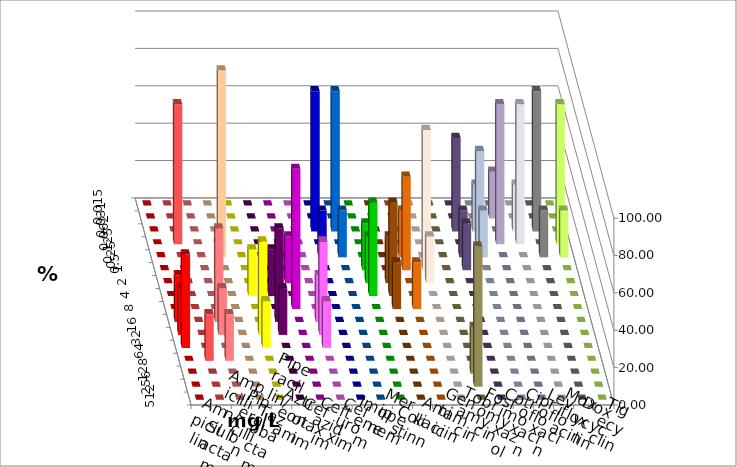
| Category | Ampicillin | Ampicillin/ Sulbactam | Piperacillin | Piperacillin/ Tazobactam | Aztreonam | Cefotaxim | Ceftazidim | Cefuroxim | Imipenem | Meropenem | Colistin | Amikacin | Gentamicin | Tobramycin | Fosfomycin | Cotrimoxazol | Ciprofloxacin | Levofloxacin | Moxifloxacin | Doxycyclin | Tigecyclin |
|---|---|---|---|---|---|---|---|---|---|---|---|---|---|---|---|---|---|---|---|---|---|
| 0.015 | 0 | 0 | 0 | 0 | 0 | 0 | 0 | 0 | 0 | 0 | 0 | 0 | 0 | 0 | 0 | 0 | 0 | 0 | 0 | 0 | 0 |
| 0.031 | 0 | 0 | 0 | 0 | 0 | 0 | 0 | 0 | 0 | 0 | 0 | 0 | 0 | 0 | 0 | 0 | 0 | 25 | 0 | 0 | 0 |
| 0.062 | 0 | 0 | 0 | 0 | 0 | 0 | 0 | 0 | 75 | 75 | 0 | 0 | 0 | 0 | 0 | 50 | 25 | 0 | 25 | 75 | 0 |
| 0.125 | 0 | 75 | 0 | 0 | 0 | 0 | 0 | 0 | 0 | 0 | 0 | 0 | 0 | 0 | 0 | 0 | 50 | 75 | 75 | 0 | 75 |
| 0.25 | 0 | 0 | 0 | 100 | 0 | 0 | 0 | 0 | 25 | 25 | 0 | 0 | 25 | 0 | 0 | 25 | 25 | 0 | 0 | 25 | 25 |
| 0.5 | 0 | 0 | 0 | 0 | 0 | 0 | 0 | 0 | 0 | 0 | 25 | 0 | 50 | 75 | 0 | 25 | 0 | 0 | 0 | 0 | 0 |
| 1.0 | 0 | 0 | 0 | 0 | 0 | 0 | 25 | 0 | 0 | 0 | 25 | 25 | 0 | 25 | 0 | 0 | 0 | 0 | 0 | 0 | 0 |
| 2.0 | 0 | 0 | 0 | 0 | 25 | 25 | 0 | 0 | 0 | 0 | 50 | 50 | 0 | 0 | 0 | 0 | 0 | 0 | 0 | 0 | 0 |
| 4.0 | 0 | 0 | 0 | 0 | 0 | 0 | 75 | 0 | 0 | 0 | 0 | 25 | 25 | 0 | 0 | 0 | 0 | 0 | 0 | 0 | 0 |
| 8.0 | 25 | 0 | 50 | 0 | 0 | 50 | 0 | 25 | 0 | 0 | 0 | 0 | 0 | 0 | 0 | 0 | 0 | 0 | 0 | 0 | 0 |
| 16.0 | 25 | 0 | 25 | 0 | 50 | 25 | 0 | 50 | 0 | 0 | 0 | 0 | 0 | 0 | 0 | 0 | 0 | 0 | 0 | 0 | 0 |
| 32.0 | 50 | 0 | 0 | 0 | 25 | 0 | 0 | 25 | 0 | 0 | 0 | 0 | 0 | 0 | 0 | 0 | 0 | 0 | 0 | 0 | 0 |
| 64.0 | 0 | 25 | 25 | 0 | 0 | 0 | 0 | 0 | 0 | 0 | 0 | 0 | 0 | 0 | 0 | 0 | 0 | 0 | 0 | 0 | 0 |
| 128.0 | 0 | 0 | 0 | 0 | 0 | 0 | 0 | 0 | 0 | 0 | 0 | 0 | 0 | 0 | 25 | 0 | 0 | 0 | 0 | 0 | 0 |
| 256.0 | 0 | 0 | 0 | 0 | 0 | 0 | 0 | 0 | 0 | 0 | 0 | 0 | 0 | 0 | 75 | 0 | 0 | 0 | 0 | 0 | 0 |
| 512.0 | 0 | 0 | 0 | 0 | 0 | 0 | 0 | 0 | 0 | 0 | 0 | 0 | 0 | 0 | 0 | 0 | 0 | 0 | 0 | 0 | 0 |